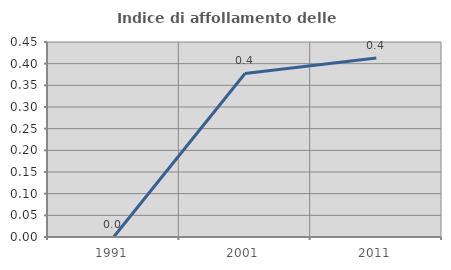
| Category | Indice di affollamento delle abitazioni  |
|---|---|
| 1991.0 | 0 |
| 2001.0 | 0.377 |
| 2011.0 | 0.413 |